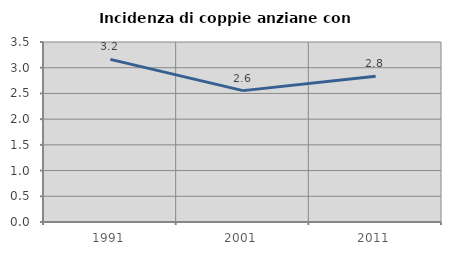
| Category | Incidenza di coppie anziane con figli |
|---|---|
| 1991.0 | 3.162 |
| 2001.0 | 2.554 |
| 2011.0 | 2.834 |